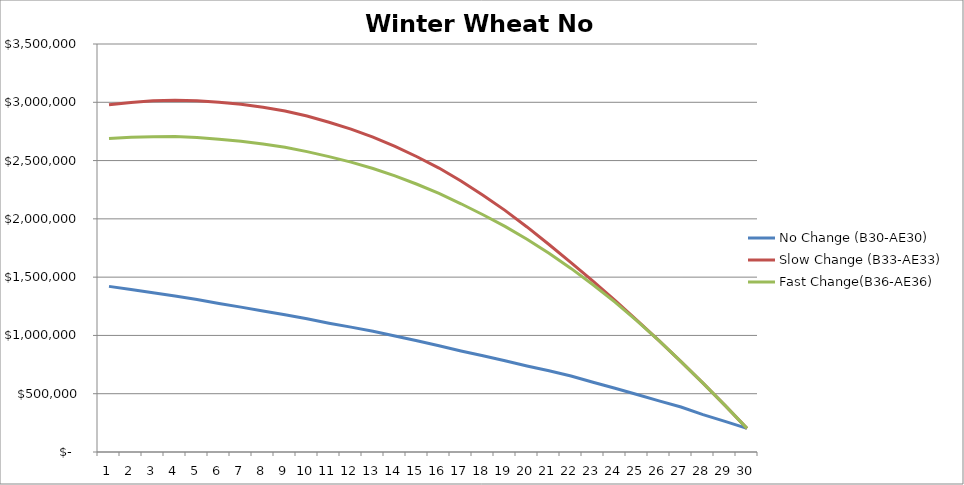
| Category | No Change (B30-AE30) | Slow Change (B33-AE33) | Fast Change(B36-AE36) |
|---|---|---|---|
| 0 | 1420703.308 | 2979405.477 | 2688666.408 |
| 1 | 1393370.695 | 2998833.929 | 2699372.687 |
| 2 | 1365498.282 | 3012237.021 | 2705346.607 |
| 3 | 1339023.04 | 3018076.961 | 2705928.688 |
| 4 | 1308347.063 | 3013928.339 | 2698775.97 |
| 5 | 1273753.103 | 3000215.208 | 2683572.344 |
| 6 | 1242843.246 | 2982590.236 | 2666483.55 |
| 7 | 1209193.009 | 2956806.983 | 2642637.265 |
| 8 | 1177223.667 | 2924933.734 | 2614140.152 |
| 9 | 1142513.753 | 2882004.284 | 2577000.453 |
| 10 | 1105140.814 | 2829202.512 | 2533934.951 |
| 11 | 1071353.905 | 2770309.234 | 2486499.706 |
| 12 | 1035139.559 | 2700989.173 | 2432349.788 |
| 13 | 995393.264 | 2621607.194 | 2368750.612 |
| 14 | 954209.89 | 2532768.308 | 2296721.494 |
| 15 | 912179.429 | 2435820.611 | 2217805.614 |
| 16 | 867021.95 | 2324075.057 | 2129415.59 |
| 17 | 824959.789 | 2202459.104 | 2035100.156 |
| 18 | 782609.48 | 2072826.643 | 1935751.542 |
| 19 | 738288.807 | 1930705.352 | 1824689.154 |
| 20 | 696544.477 | 1779943.651 | 1704586.603 |
| 21 | 652238.124 | 1625290.908 | 1575029.915 |
| 22 | 598621.18 | 1465098.359 | 1434329.692 |
| 23 | 547158.516 | 1300845.94 | 1285315.111 |
| 24 | 493643.122 | 1128959.639 | 1124391.188 |
| 25 | 438201.229 | 955271.663 | 955271.663 |
| 26 | 385618.538 | 775910.081 | 775910.081 |
| 27 | 321086.1 | 591041.097 | 591041.097 |
| 28 | 262818.396 | 399654.095 | 399654.095 |
| 29 | 202461.118 | 202461.118 | 202461.118 |